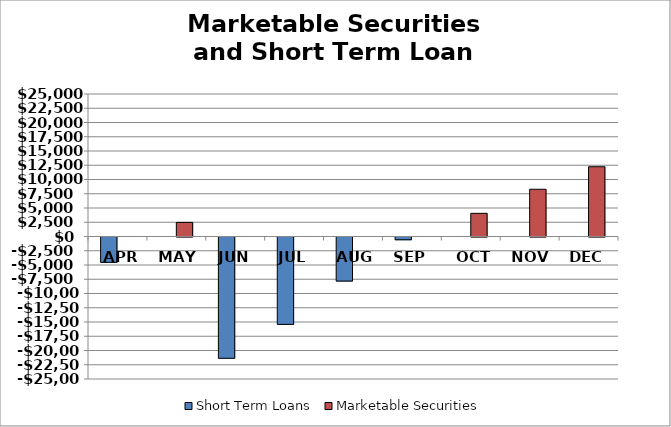
| Category | Short Term Loans | Marketable Securities |
|---|---|---|
| APR | -4450 | 0 |
| MAY | 0 | 2475 |
| JUN | -21275 | 0 |
| JUL | -15330 | 0 |
| AUG | -7735 | 0 |
| SEP | -485 | 0 |
| OCT | 0 | 4065 |
| NOV | 0 | 8290 |
| DEC | 0 | 12240 |